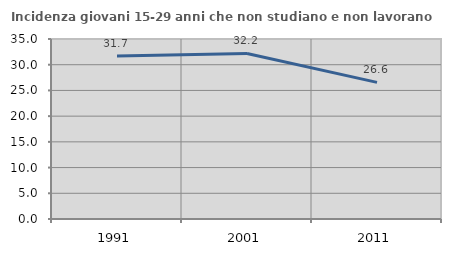
| Category | Incidenza giovani 15-29 anni che non studiano e non lavorano  |
|---|---|
| 1991.0 | 31.686 |
| 2001.0 | 32.182 |
| 2011.0 | 26.567 |